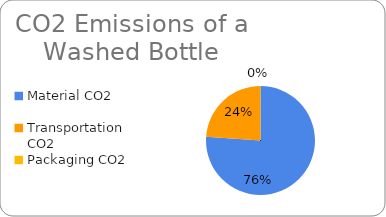
| Category | Series 0 |
|---|---|
| Material CO2 | 0.008 |
| Transportation CO2 | 0.002 |
| Packaging CO2 | 0 |